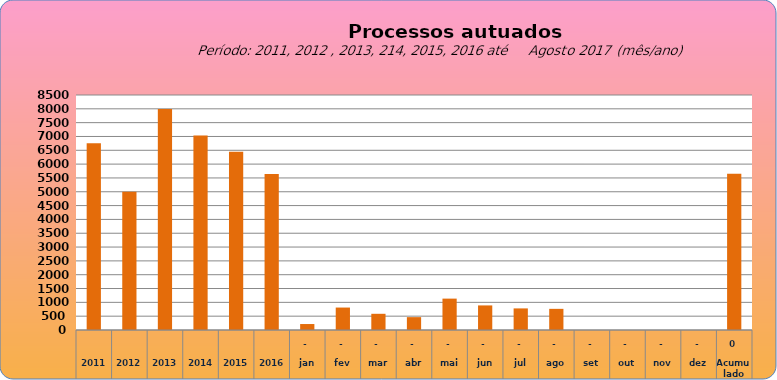
| Category | 6755 |
|---|---|
| 2011 | 6755 |
| 2012 | 4997 |
| 2013 | 7990 |
| 2014 | 7034 |
| 2015 | 6446 |
| 2016 | 5644 |
| jan | 216 |
| fev | 812 |
| mar | 586 |
| abr | 465 |
| mai | 1135 |
| jun | 889 |
| jul | 781 |
| ago | 765 |
| set | 0 |
| out | 0 |
| nov | 0 |
| dez | 0 |
| Acumulado
 | 5649 |